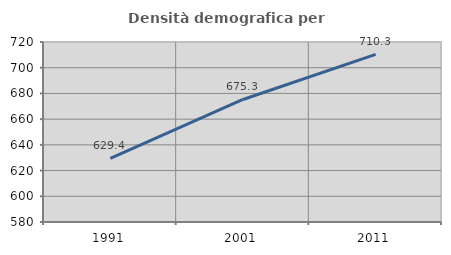
| Category | Densità demografica |
|---|---|
| 1991.0 | 629.439 |
| 2001.0 | 675.301 |
| 2011.0 | 710.343 |